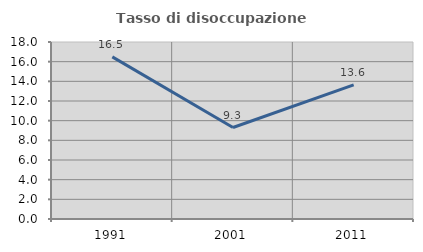
| Category | Tasso di disoccupazione giovanile  |
|---|---|
| 1991.0 | 16.484 |
| 2001.0 | 9.302 |
| 2011.0 | 13.636 |